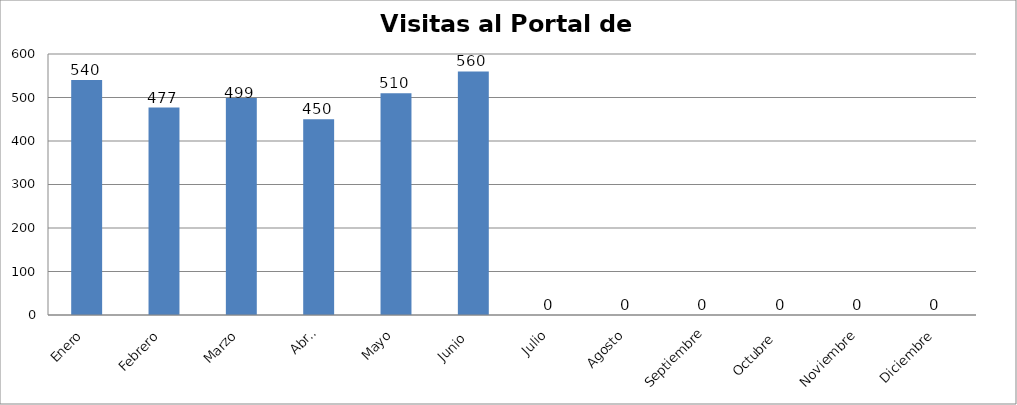
| Category | Series 0 |
|---|---|
| Enero | 540 |
| Febrero | 477 |
| Marzo | 499 |
| Abril | 450 |
| Mayo | 510 |
| Junio  | 560 |
| Julio | 0 |
| Agosto | 0 |
| Septiembre | 0 |
| Octubre  | 0 |
| Noviembre | 0 |
| Diciembre | 0 |